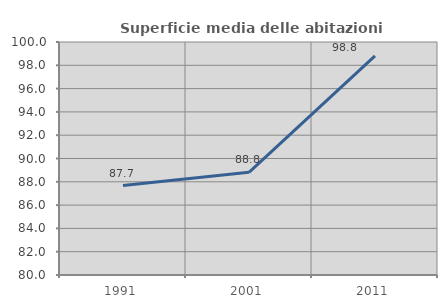
| Category | Superficie media delle abitazioni occupate |
|---|---|
| 1991.0 | 87.675 |
| 2001.0 | 88.811 |
| 2011.0 | 98.807 |